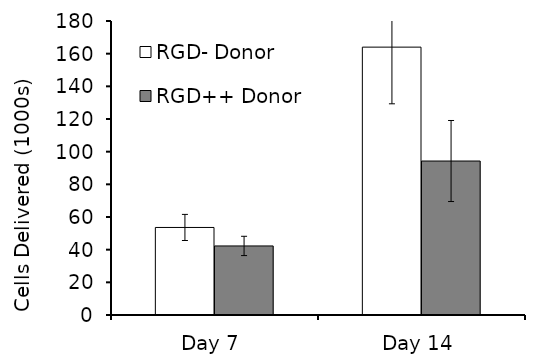
| Category | RGD- Donor | RGD++ Donor |
|---|---|---|
| Day 7 | 53.6 | 42.28 |
| Day 14 | 164 | 94.275 |